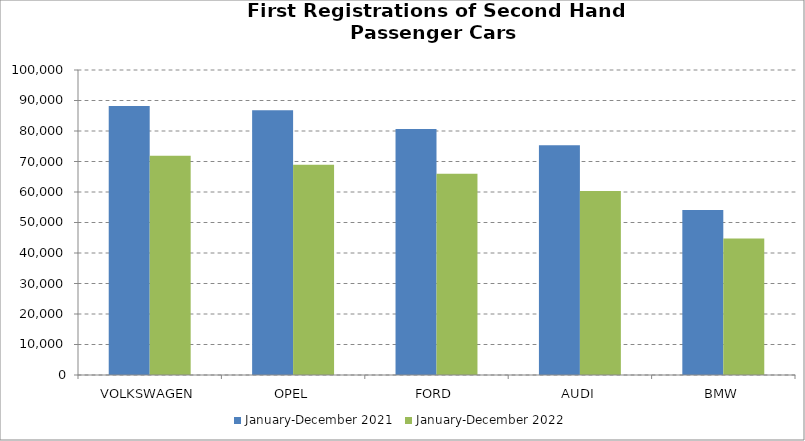
| Category | January-December 2021 | January-December 2022 |
|---|---|---|
| VOLKSWAGEN | 88195 | 71862 |
| OPEL | 86839 | 68912 |
| FORD | 80652 | 65961 |
| AUDI | 75336 | 60314 |
| BMW | 54136 | 44789 |